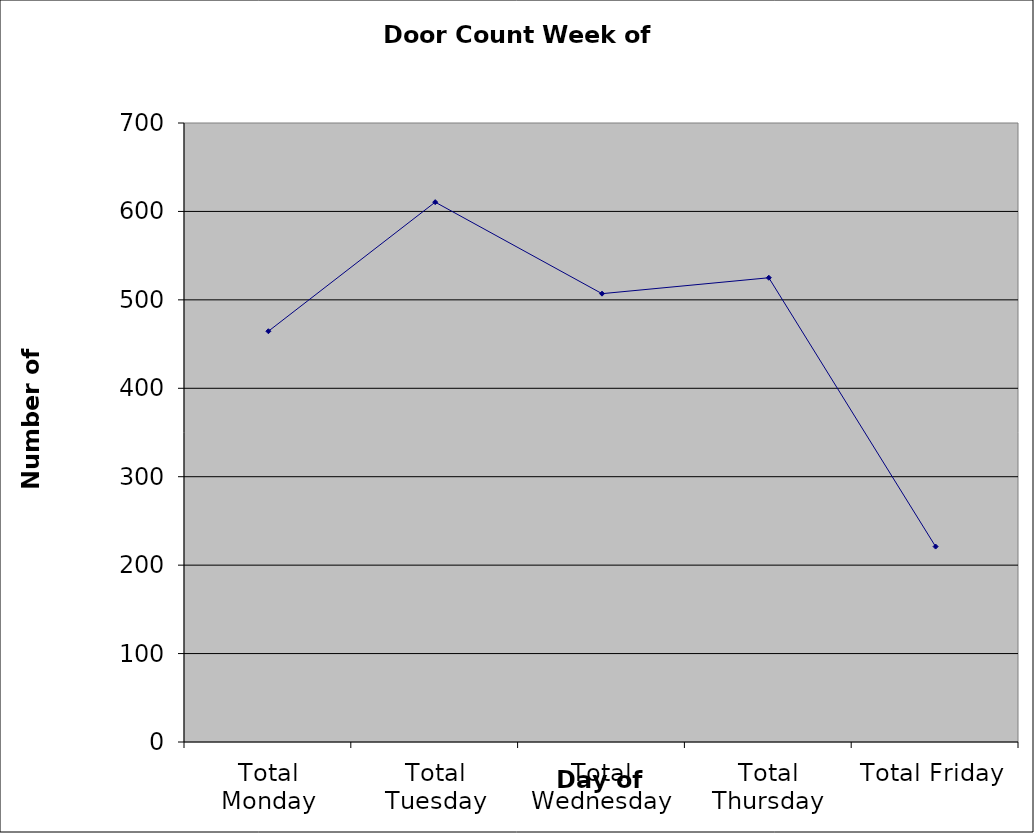
| Category | Series 0 |
|---|---|
| Total Monday | 464.5 |
| Total Tuesday | 610.5 |
| Total Wednesday | 507 |
| Total Thursday | 525 |
| Total Friday | 221 |